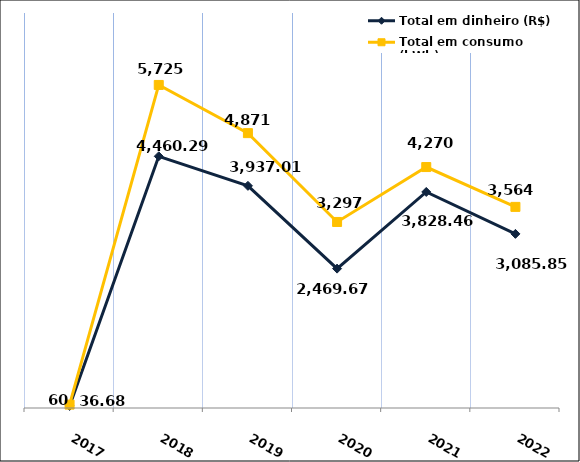
| Category | Total em dinheiro (R$) |
|---|---|
| 2017.0 | 36.68 |
| 2018.0 | 4460.29 |
| 2019.0 | 3937.01 |
| 2020.0 | 2469.67 |
| 2021.0 | 3828.46 |
| 2022.0 | 3085.85 |